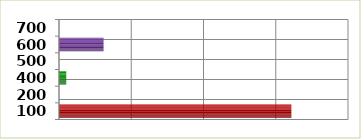
| Category | Series 0 |
|---|---|
| 100.0 | 1608000 |
| 200.0 | 0 |
| 400.0 | 50000 |
| 500.0 | 0 |
| 600.0 | 308140 |
| 700.0 | 0 |